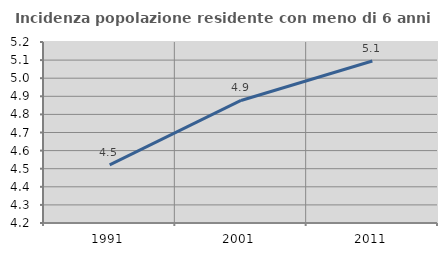
| Category | Incidenza popolazione residente con meno di 6 anni |
|---|---|
| 1991.0 | 4.521 |
| 2001.0 | 4.877 |
| 2011.0 | 5.095 |